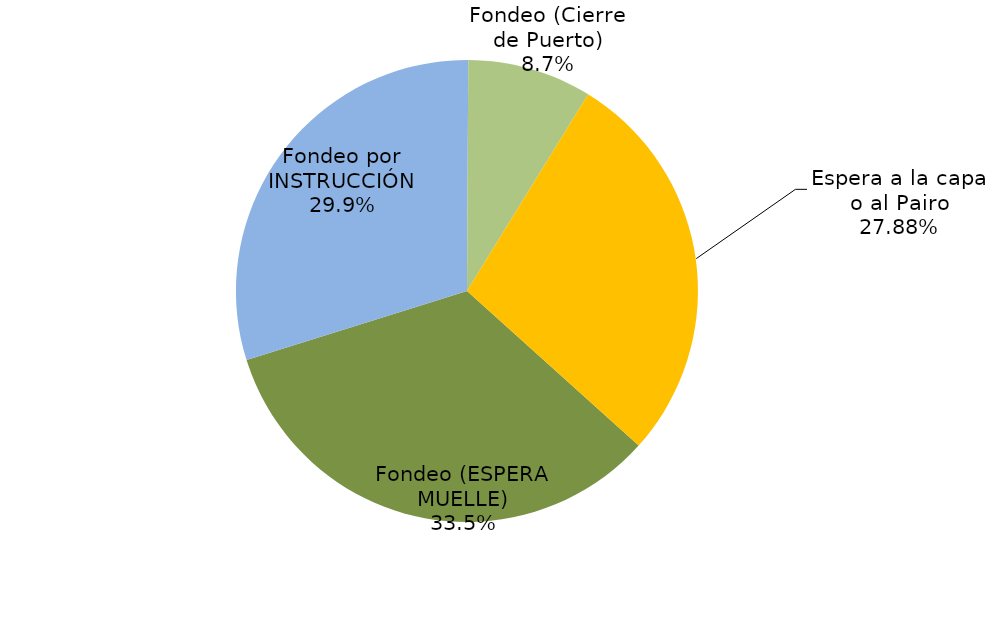
| Category | Series 0 |
|---|---|
| Fondeo (ESPERA MUELLE) | 25325.55 |
| Fondeo por INSTRUCCIÓN | 22623.833 |
| Fondeo (Cierre de Puerto) | 6577.183 |
| Espera a la capa o al Pairo | 21078.7 |